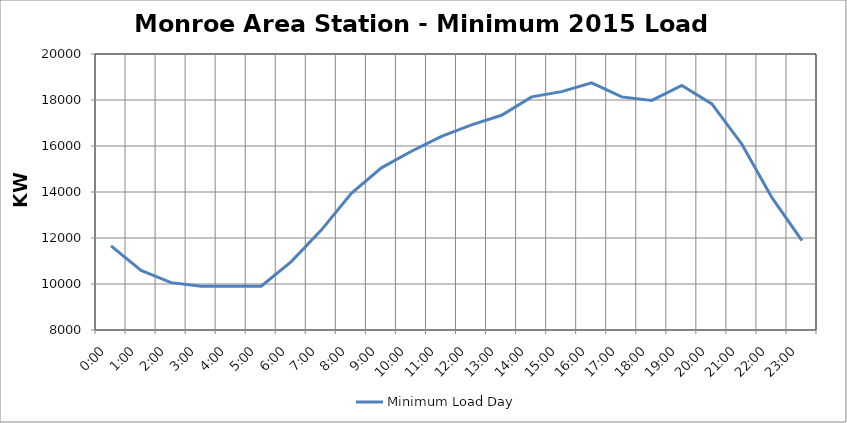
| Category | Minimum Load Day |
|---|---|
| 0.0 | 11658.6 |
| 0.041666666666666664 | 10591.8 |
| 0.08333333333333333 | 10058.4 |
| 0.125 | 9906 |
| 0.16666666666666666 | 9906 |
| 0.20833333333333334 | 9906 |
| 0.25 | 10972.8 |
| 0.2916666666666667 | 12344.4 |
| 0.3333333333333333 | 13944.6 |
| 0.375 | 15049.5 |
| 0.4166666666666667 | 15773.4 |
| 0.4583333333333333 | 16421.1 |
| 0.5 | 16916.4 |
| 0.5416666666666666 | 17335.5 |
| 0.5833333333333334 | 18135.6 |
| 0.625 | 18364.2 |
| 0.6666666666666666 | 18745.2 |
| 0.7083333333333334 | 18135.6 |
| 0.75 | 17983.2 |
| 0.7916666666666666 | 18630.9 |
| 0.8333333333333334 | 17830.8 |
| 0.875 | 16078.2 |
| 0.9166666666666666 | 13754.1 |
| 0.9583333333333334 | 11887.2 |